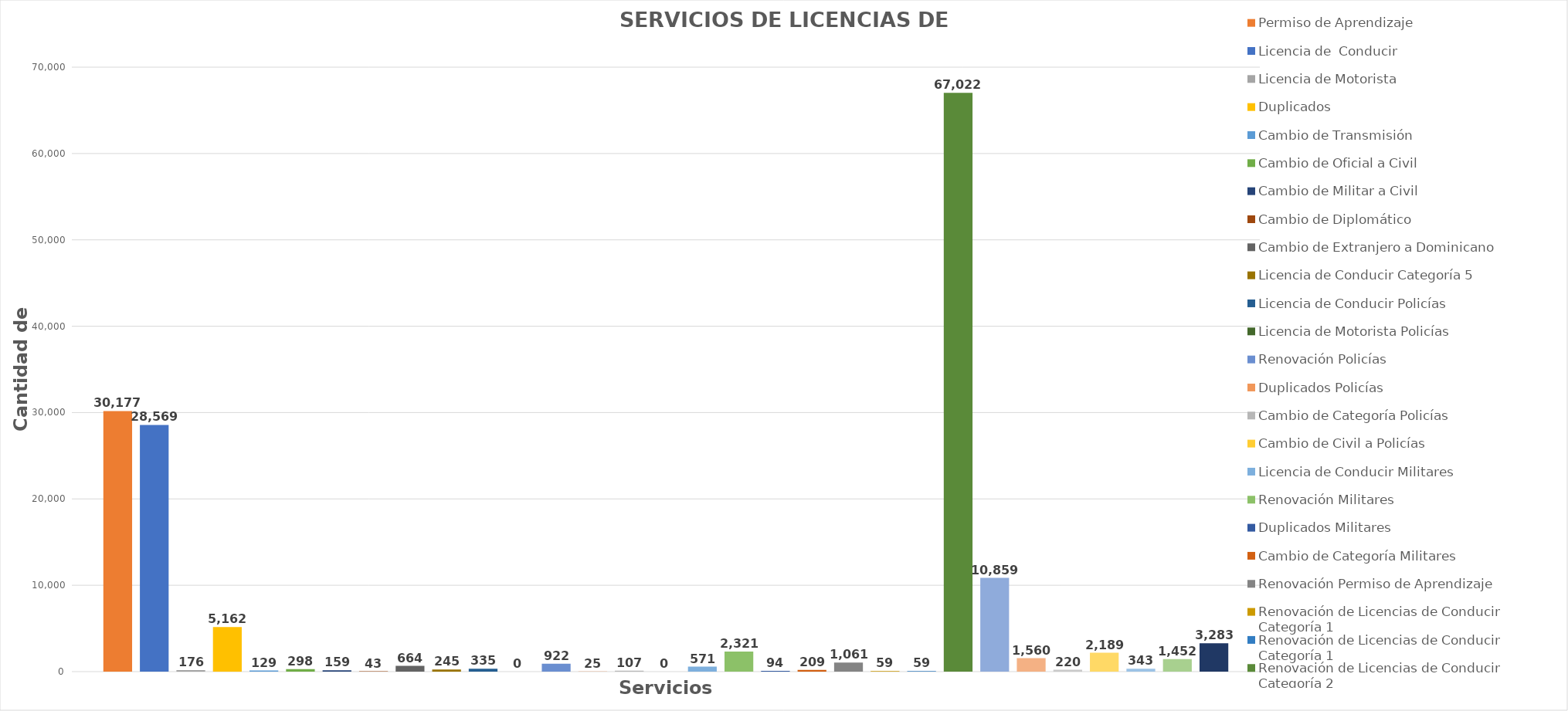
| Category | Permiso de Aprendizaje  | Licencia de  Conducir  | Licencia de Motorista | Duplicados  | Cambio de Transmisión  | Cambio de Oficial a Civil | Cambio de Militar a Civil | Cambio de Diplomático | Cambio de Extranjero a Dominicano | Licencia de Conducir Categoría 5 | Licencia de Conducir Policías | Licencia de Motorista Policías | Renovación Policías | Duplicados Policías | Cambio de Categoría Policías | Cambio de Civil a Policías | Licencia de Conducir Militares | Renovación Militares | Duplicados Militares | Cambio de Categoría Militares | Renovación Permiso de Aprendizaje | Renovación de Licencias de Conducir Categoría 1 | Renovación de Licencias de Conducir Categoría 2 | Renovación de Licencias de Conducir Categoría 3 | Renovación de Licencias de Conducir Categoría 4 | Renovación de Licencias de Conducir Categoría 5 | Cambio de Licencias de Conducir Categoría 3  | Cambio de Licencias de Conducir Categoría 4  | Re-Examen Teórico | Re-Examen Práctico |
|---|---|---|---|---|---|---|---|---|---|---|---|---|---|---|---|---|---|---|---|---|---|---|---|---|---|---|---|---|---|---|
| 0 | 30177 | 28569 | 176 | 5162 | 129 | 298 | 159 | 43 | 664 | 245 | 335 | 0 | 922 | 25 | 107 | 0 | 571 | 2321 | 94 | 209 | 1061 | 59 | 67022 | 10859 | 1560 | 220 | 2189 | 343 | 1452 | 3283 |